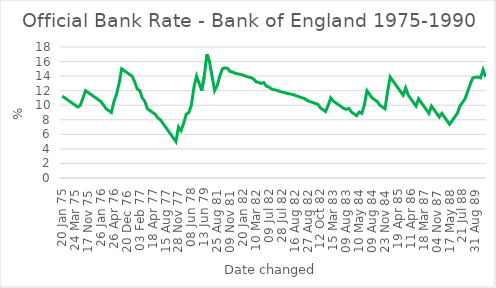
| Category | Series 0 |
|---|---|
| 20 Jan 75 | 11.25 |
| 27 Jan 75 | 11 |
| 10 Feb 75 | 10.75 |
| 17 Feb 75 | 10.5 |
| 10 Mar 75 | 10.25 |
| 24 Mar 75 | 10 |
| 21 Apr 75 | 9.75 |
| 05 May 75 | 10 |
| 28 Jul 75 | 11 |
| 06 Oct 75 | 12 |
| 17 Nov 75 | 11.75 |
| 01 Dec 75 | 11.5 |
| 29 Dec 75 | 11.25 |
| 05 Jan 76 | 11 |
| 19 Jan 76 | 10.75 |
| 26 Jan 76 | 10.5 |
| 02 Feb 76 | 10 |
| 09 Feb 76 | 9.5 |
| 01 Mar 76 | 9.25 |
| 08 Mar 76 | 9 |
| 26 Apr 76 | 10.5 |
| 24 May 76 | 11.5 |
| 13 Sep 76 | 13 |
| 07 Oct 76 | 15 |
| 22 Nov 76 | 14.75 |
| 20 Dec 76 | 14.5 |
| 29 Dec 76 | 14.25 |
| 10 Jan 77 | 14 |
| 24 Jan 77 | 13.25 |
| 31 Jan 77 | 12.25 |
| 03 Feb 77 | 12 |
| 10 Mar 77 | 11 |
| 21 Mar 77 | 10.5 |
| 31 Mar 77 | 9.5 |
| 12 Apr 77 | 9.25 |
| 18 Apr 77 | 9 |
| 25 Apr 77 | 8.75 |
| 02 May 77 | 8.25 |
| 16 May 77 | 8 |
| 08 Aug 77 | 7.5 |
| 15 Aug 77 | 7 |
| 12 Sep 77 | 6.5 |
| 19 Sep 77 | 6 |
| 10 Oct 77 | 5.5 |
| 17 Oct 77 | 5 |
| 28 Nov 77 | 7 |
| 09 Jan 78 | 6.5 |
| 12 Apr 78 | 7.5 |
| 08 May 78 | 8.75 |
| 15 May 78 | 9 |
| 08 Jun 78 | 10 |
| 09 Nov 78 | 12.5 |
| 08 Feb 79 | 14 |
| 01 Mar 79 | 13 |
| 05 Apr 79 | 12 |
| 13 Jun 79 | 14 |
| 15 Nov 79 | 17 |
| 03 Jul 80 | 16 |
| 25 Nov 80 | 14 |
| 11 Mar 81 | 12 |
| 25 Aug 81 | 12.69 |
| 15 Sep 81 | 14 |
| 12 Oct 81 | 15 |
| 28 Oct 81 | 15.13 |
| 06 Nov 81 | 15.06 |
| 09 Nov 81 | 14.63 |
| 25 Nov 81 | 14.56 |
| 04 Dec 81 | 14.38 |
| 18 Jan 82 | 14.31 |
| 19 Jan 82 | 14.25 |
| 20 Jan 82 | 14.13 |
| 21 Jan 82 | 14 |
| 22 Jan 82 | 13.88 |
| 22 Feb 82 | 13.81 |
| 25 Feb 82 | 13.63 |
| 10 Mar 82 | 13.25 |
| 16 Apr 82 | 13.13 |
| 19 Apr 82 | 13 |
| 20 Apr 82 | 13.13 |
| 08 Jun 82 | 12.63 |
| 09 Jul 82 | 12.5 |
| 12 Jul 82 | 12.25 |
| 13 Jul 82 | 12.13 |
| 21 Jul 82 | 12.06 |
| 26 Jul 82 | 11.94 |
| 28 Jul 82 | 11.81 |
| 29 Jul 82 | 11.75 |
| 30 Jul 82 | 11.63 |
| 02 Aug 82 | 11.56 |
| 04 Aug 82 | 11.5 |
| 16 Aug 82 | 11.38 |
| 17 Aug 82 | 11.25 |
| 24 Aug 82 | 11.13 |
| 25 Aug 82 | 11 |
| 26 Aug 82 | 10.88 |
| 27 Aug 82 | 10.63 |
| 27 Sep 82 | 10.5 |
| 28 Sep 82 | 10.38 |
| 29 Sep 82 | 10.25 |
| 30 Sep 82 | 10.13 |
| 12 Oct 82 | 9.63 |
| 01 Nov 82 | 9.38 |
| 02 Nov 82 | 9.13 |
| 26 Nov 82 | 10 |
| 12 Jan 83 | 11 |
| 15 Mar 83 | 10.56 |
| 13 Apr 83 | 10.31 |
| 14 Apr 83 | 10.06 |
| 13 Jun 83 | 9.81 |
| 14 Jun 83 | 9.56 |
| 09 Aug 83 | 9.44 |
| 10 Aug 83 | 9.56 |
| 03 Oct 83 | 9.06 |
| 07 Mar 84 | 8.81 |
| 14 Mar 84 | 8.56 |
| 10 May 84 | 9.06 |
| 29 Jun 84 | 8.88 |
| 06 Jul 84 | 10 |
| 11 Jul 84 | 12 |
| 08 Aug 84 | 11.5 |
| 09 Aug 84 | 11 |
| 16 Aug 84 | 10.75 |
| 17 Aug 84 | 10.5 |
| 05 Nov 84 | 10 |
| 19 Nov 84 | 9.75 |
| 23 Nov 84 | 9.5 |
| 14 Jan 85 | 11.88 |
| 28 Jan 85 | 13.88 |
| 20 Mar 85 | 13.38 |
| 28 Mar 85 | 12.88 |
| 19 Apr 85 | 12.38 |
| 11 Jul 85 | 11.88 |
| 26 Jul 85 | 11.38 |
| 15 Jan 86 | 12.38 |
| 19 Mar 86 | 11.38 |
| 11 Apr 86 | 10.88 |
| 18 Apr 86 | 10.38 |
| 23 May 86 | 9.88 |
| 15 Oct 86 | 10.88 |
| 09 Mar 87 | 10.38 |
| 18 Mar 87 | 9.88 |
| 28 Apr 87 | 9.38 |
| 08 May 87 | 8.88 |
| 06 Aug 87 | 9.88 |
| 23 Oct 87 | 9.38 |
| 04 Nov 87 | 8.88 |
| 03 Dec 87 | 8.38 |
| 01 Feb 88 | 8.88 |
| 17 Mar 88 | 8.38 |
| 08 Apr 88 | 7.88 |
| 17 May 88 | 7.38 |
| 03 Jun 88 | 7.88 |
| 10 Jun 88 | 8.38 |
| 24 Jun 88 | 8.88 |
| 07 Jul 88 | 9.88 |
| 21 Jul 88 | 10.38 |
| 08 Aug 88 | 10.88 |
| 25 Aug 88 | 11.88 |
| 25 Nov 88 | 12.88 |
| 25 May 89 | 13.75 |
| 31 Aug 89 | 13.84 |
| 04 Sep 89 | 13.88 |
| 08 Sep 89 | 13.75 |
| 06 Oct 89 | 14.88 |
| 08 Oct 90 | 13.88 |